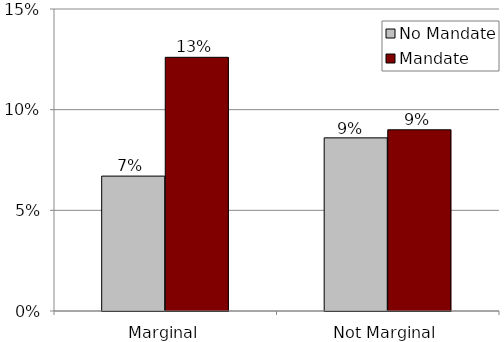
| Category | No Mandate | Mandate |
|---|---|---|
| Marginal | 0.067 | 0.126 |
| Not Marginal | 0.086 | 0.09 |